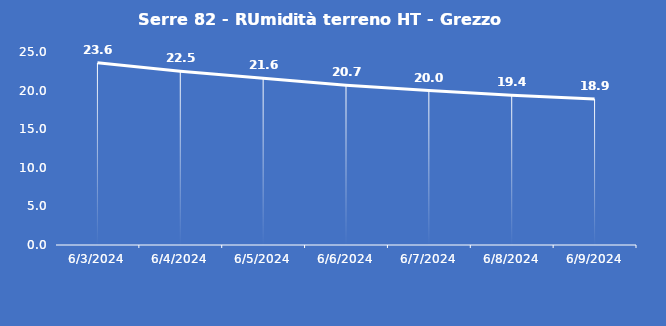
| Category | Serre 82 - RUmidità terreno HT - Grezzo (%VWC) |
|---|---|
| 6/3/24 | 23.6 |
| 6/4/24 | 22.5 |
| 6/5/24 | 21.6 |
| 6/6/24 | 20.7 |
| 6/7/24 | 20 |
| 6/8/24 | 19.4 |
| 6/9/24 | 18.9 |